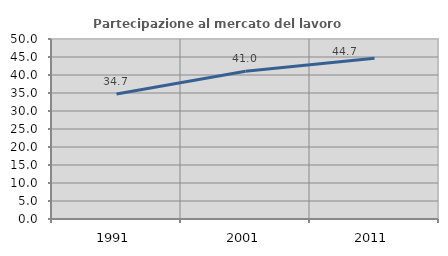
| Category | Partecipazione al mercato del lavoro  femminile |
|---|---|
| 1991.0 | 34.718 |
| 2001.0 | 41.049 |
| 2011.0 | 44.66 |